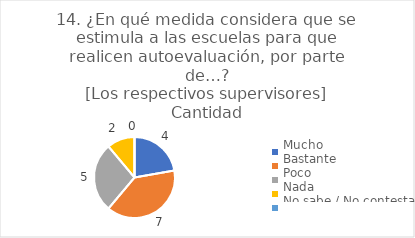
| Category | 14. ¿En qué medida considera que se estimula a las escuelas para que realicen autoevaluación, por parte de…?
[Los respectivos supervisores] |
|---|---|
| Mucho  | 0.222 |
| Bastante  | 0.389 |
| Poco  | 0.278 |
| Nada  | 0.111 |
| No sabe / No contesta | 0 |